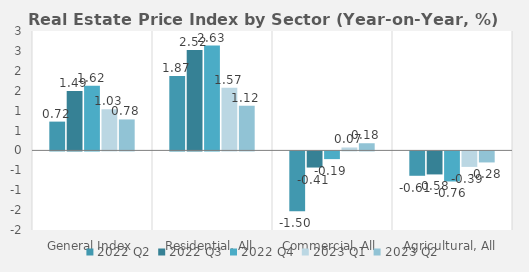
| Category | 2022 | 2023 |
|---|---|---|
| General Index | 1.625 | 0.778 |
| Residential, All | 2.634 | 1.122 |
| Commercial, All | -0.194 | 0.18 |
| Agricultural, All | -0.756 | -0.277 |